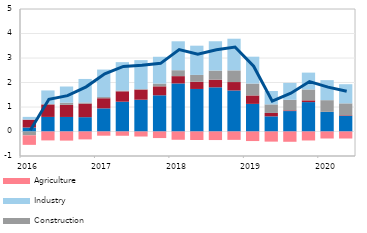
| Category | Other sectors | Trade | Construction | Industry | Agriculture |
|---|---|---|---|---|---|
| 2016 | 0.163 | 0.321 | -0.156 | 0.113 | -0.39 |
| II | 0.595 | 0.508 | 0.015 | 0.558 | -0.363 |
| III | 0.594 | 0.494 | 0.088 | 0.66 | -0.372 |
| IV | 0.585 | 0.553 | 0.046 | 0.96 | -0.322 |
| 2017 | 0.945 | 0.413 | 0.049 | 1.121 | -0.172 |
| II | 1.216 | 0.424 | 0.032 | 1.158 | -0.174 |
| III | 1.297 | 0.414 | 0.02 | 1.182 | -0.205 |
| IV | 1.478 | 0.366 | 0.113 | 1.094 | -0.268 |
| 2018 | 1.962 | 0.298 | 0.242 | 1.18 | -0.338 |
| II | 1.736 | 0.292 | 0.281 | 1.193 | -0.346 |
| III | 1.803 | 0.311 | 0.372 | 1.197 | -0.349 |
| IV | 1.675 | 0.344 | 0.476 | 1.293 | -0.341 |
| 2019 | 1.127 | 0.345 | 0.485 | 1.097 | -0.39 |
| II | 0.619 | 0.139 | 0.349 | 0.547 | -0.413 |
| III | 0.834 | 0.029 | 0.43 | 0.691 | -0.42 |
| IV | 1.2 | 0.072 | 0.444 | 0.687 | -0.366 |
| 2020 | 0.799 | 0.004 | 0.477 | 0.817 | -0.286 |
| II | 0.64 | 0.023 | 0.486 | 0.781 | -0.286 |